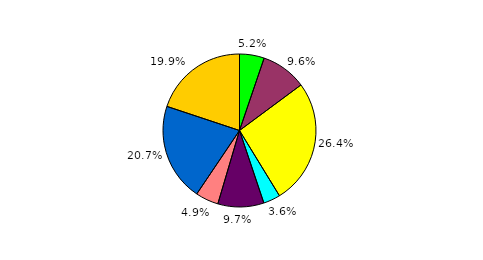
| Category | Series 0 |
|---|---|
| 0 | 5.224 |
| 1 | 9.629 |
| 2 | 26.402 |
| 3 | 3.585 |
| 4 | 9.731 |
| 5 | 4.866 |
| 6 | 20.666 |
| 7 | 19.898 |